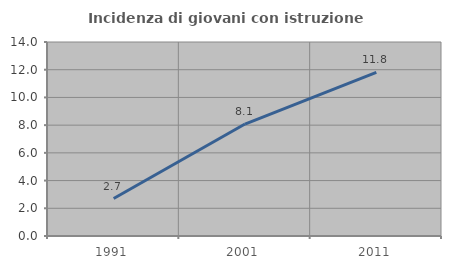
| Category | Incidenza di giovani con istruzione universitaria |
|---|---|
| 1991.0 | 2.703 |
| 2001.0 | 8.081 |
| 2011.0 | 11.811 |